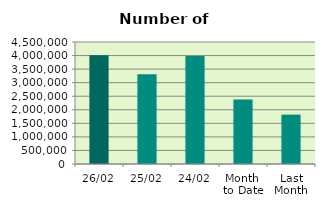
| Category | Series 0 |
|---|---|
| 26/02 | 4007972 |
| 25/02 | 3307514 |
| 24/02 | 3983066 |
| Month 
to Date | 2379027.222 |
| Last
Month | 1821445.364 |